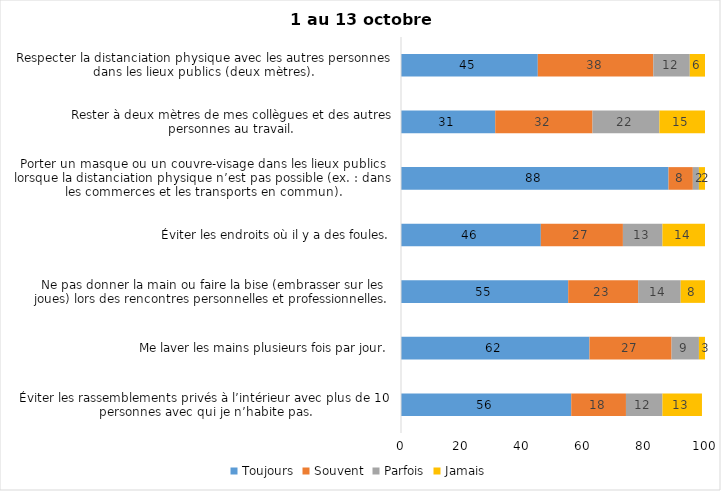
| Category | Toujours | Souvent | Parfois | Jamais |
|---|---|---|---|---|
| Éviter les rassemblements privés à l’intérieur avec plus de 10 personnes avec qui je n’habite pas. | 56 | 18 | 12 | 13 |
| Me laver les mains plusieurs fois par jour. | 62 | 27 | 9 | 3 |
| Ne pas donner la main ou faire la bise (embrasser sur les joues) lors des rencontres personnelles et professionnelles. | 55 | 23 | 14 | 8 |
| Éviter les endroits où il y a des foules. | 46 | 27 | 13 | 14 |
| Porter un masque ou un couvre-visage dans les lieux publics lorsque la distanciation physique n’est pas possible (ex. : dans les commerces et les transports en commun). | 88 | 8 | 2 | 2 |
| Rester à deux mètres de mes collègues et des autres personnes au travail. | 31 | 32 | 22 | 15 |
| Respecter la distanciation physique avec les autres personnes dans les lieux publics (deux mètres). | 45 | 38 | 12 | 6 |